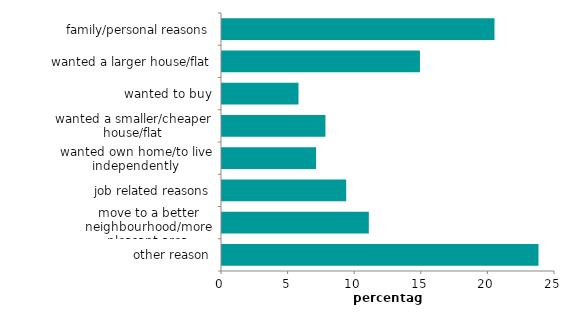
| Category | Series 0 |
|---|---|
| other reason | 23.759 |
| move to a better neighbourhood/more pleasant area | 11.023 |
| job related reasons | 9.325 |
| wanted own home/to live independently | 7.063 |
| wanted a smaller/cheaper house/flat | 7.765 |
| wanted to buy | 5.743 |
| wanted a larger house/flat | 14.862 |
| family/personal reasons | 20.459 |